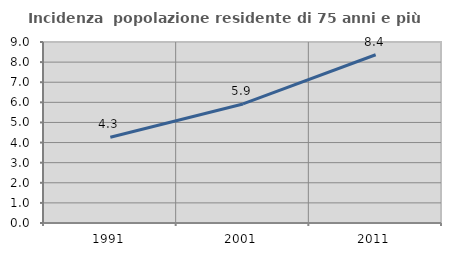
| Category | Incidenza  popolazione residente di 75 anni e più |
|---|---|
| 1991.0 | 4.262 |
| 2001.0 | 5.92 |
| 2011.0 | 8.365 |